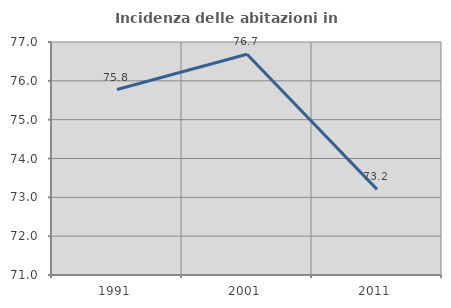
| Category | Incidenza delle abitazioni in proprietà  |
|---|---|
| 1991.0 | 75.776 |
| 2001.0 | 76.684 |
| 2011.0 | 73.206 |